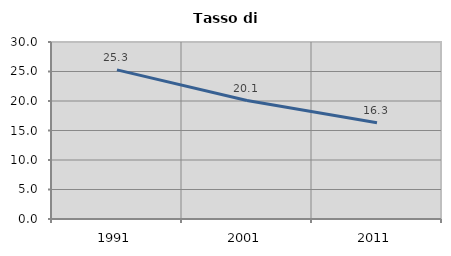
| Category | Tasso di disoccupazione   |
|---|---|
| 1991.0 | 25.274 |
| 2001.0 | 20.075 |
| 2011.0 | 16.324 |